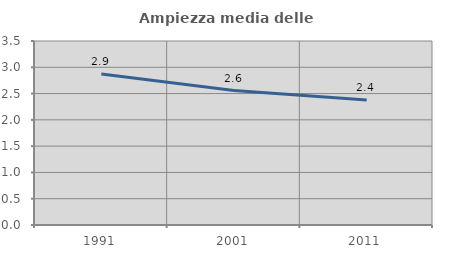
| Category | Ampiezza media delle famiglie |
|---|---|
| 1991.0 | 2.872 |
| 2001.0 | 2.557 |
| 2011.0 | 2.379 |